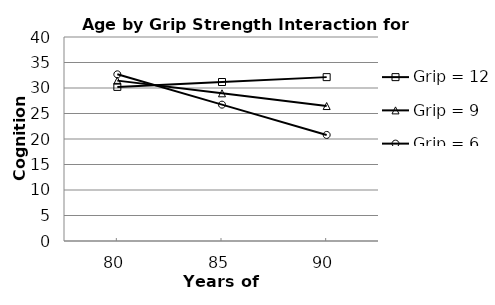
| Category | Grip = 12 | Grip = 9 | Grip = 6 |
|---|---|---|---|
| 80.0 | 30.215 | 31.447 | 32.679 |
| 85.0 | 31.174 | 28.956 | 26.738 |
| 90.0 | 32.132 | 26.464 | 20.796 |